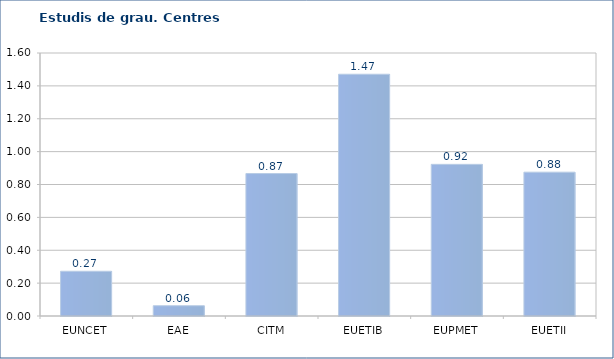
| Category | Series 0 |
|---|---|
| EUNCET | 0.272 |
| EAE | 0.062 |
| CITM | 0.867 |
| EUETIB | 1.471 |
| EUPMET | 0.923 |
| EUETII | 0.875 |